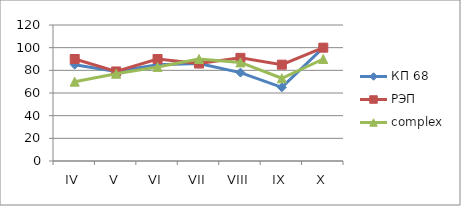
| Category | КП 68 | РЭП  | complex |
|---|---|---|---|
| IV | 85 | 90 | 70 |
| V | 79 | 79 | 77 |
| VI | 85 | 90 | 83 |
| VII | 86 | 86 | 90 |
| VIII | 78 | 91 | 87 |
| IX | 65 | 85 | 73 |
| X | 100 | 100 | 90 |